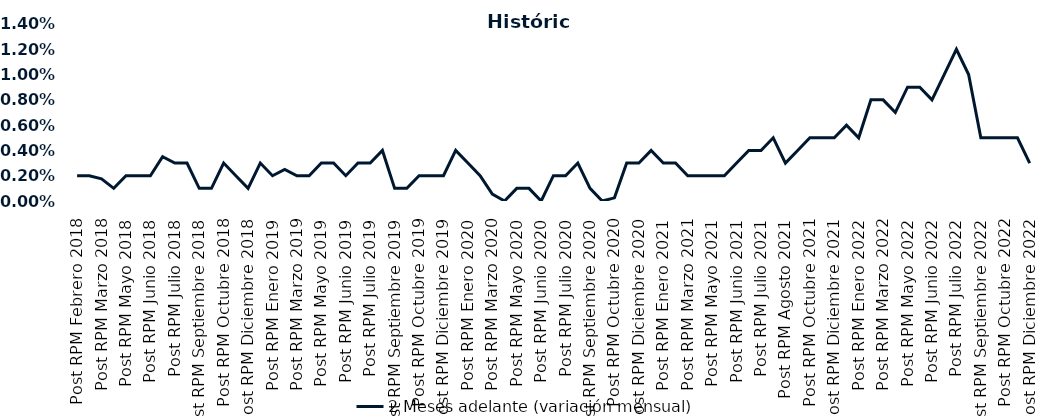
| Category | 2 Meses adelante (variación mensual) |
|---|---|
| Post RPM Febrero 2018 | 0.002 |
| Pre RPM Marzo 2018 | 0.002 |
| Post RPM Marzo 2018 | 0.002 |
| Pre RPM Mayo 2018 | 0.001 |
| Post RPM Mayo 2018 | 0.002 |
| Pre RPM Junio 2018 | 0.002 |
| Post RPM Junio 2018 | 0.002 |
| Pre RPM Julio 2018 | 0.004 |
| Post RPM Julio 2018 | 0.003 |
| Pre RPM Septiembre 2018 | 0.003 |
| Post RPM Septiembre 2018 | 0.001 |
| Pre RPM Octubre 2018 | 0.001 |
| Post RPM Octubre 2018 | 0.003 |
| Pre RPM Diciembre 2018 | 0.002 |
| Post RPM Diciembre 2018 | 0.001 |
| Pre RPM Enero 2019 | 0.003 |
| Post RPM Enero 2019 | 0.002 |
| Pre RPM Marzo 2019 | 0.002 |
| Post RPM Marzo 2019 | 0.002 |
| Pre RPM Mayo 2019 | 0.002 |
| Post RPM Mayo 2019 | 0.003 |
| Pre RPM Junio 2019 | 0.003 |
| Post RPM Junio 2019 | 0.002 |
| Pre RPM Julio 2019 | 0.003 |
| Post RPM Julio 2019 | 0.003 |
| Pre RPM Septiembre 2019 | 0.004 |
| Post RPM Septiembre 2019 | 0.001 |
| Pre RPM Octubre 2019 | 0.001 |
| Post RPM Octubre 2019 | 0.002 |
| Pre RPM Diciembre 2019 | 0.002 |
| Post RPM Diciembre 2019 | 0.002 |
| Pre RPM Enero 2020 | 0.004 |
| Post RPM Enero 2020 | 0.003 |
| Pre RPM Marzo 2020 | 0.002 |
| Post RPM Marzo 2020 | 0.001 |
| Pre RPM Mayo 2020 | 0 |
| Post RPM Mayo 2020 | 0.001 |
| Pre RPM Junio 2020 | 0.001 |
| Post RPM Junio 2020 | 0 |
| Pre RPM Julio 2020 | 0.002 |
| Post RPM Julio 2020 | 0.002 |
| Pre RPM Septiembre 2020 | 0.003 |
| Post RPM Septiembre 2020 | 0.001 |
| Pre RPM Octubre 2020 | 0 |
| Post RPM Octubre 2020 | 0 |
| Pre RPM Diciembre 2020 | 0.003 |
| Post RPM Diciembre 2020 | 0.003 |
| Pre RPM Enero 2021 | 0.004 |
| Post RPM Enero 2021 | 0.003 |
| Pre RPM Marzo 2021 | 0.003 |
| Post RPM Marzo 2021 | 0.002 |
| Pre RPM Mayo 2021 | 0.002 |
| Post RPM Mayo 2021 | 0.002 |
| Pre RPM Junio 2021 | 0.002 |
| Post RPM Junio 2021 | 0.003 |
| Pre RPM Julio 2021 | 0.004 |
| Post RPM Julio 2021 | 0.004 |
| Pre RPM Agosto 2021 | 0.005 |
| Post RPM Agosto 2021 | 0.003 |
| Pre RPM Octubre 2021 | 0.004 |
| Post RPM Octubre 2021 | 0.005 |
| Pre RPM Diciembre 2021 | 0.005 |
| Post RPM Diciembre 2021 | 0.005 |
| Pre RPM Enero 2022 | 0.006 |
| Post RPM Enero 2022 | 0.005 |
| Pre RPM Marzo 2022 | 0.008 |
| Post RPM Marzo 2022 | 0.008 |
| Pre RPM Mayo 2022 | 0.007 |
| Post RPM Mayo 2022 | 0.009 |
| Pre RPM Junio 2022 | 0.009 |
| Post RPM Junio 2022 | 0.008 |
| Pre RPM Julio 2022 | 0.01 |
| Post RPM Julio 2022 | 0.012 |
| Pre RPM Septiembre 2022 | 0.01 |
| Post RPM Septiembre 2022 | 0.005 |
| Pre RPM Octubre 2022 | 0.005 |
| Post RPM Octubre 2022 | 0.005 |
| Pre RPM Diciembre 2022 | 0.005 |
| Post RPM Diciembre 2022 | 0.003 |